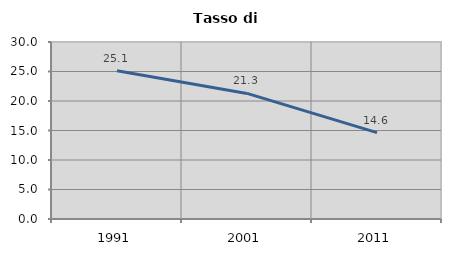
| Category | Tasso di disoccupazione   |
|---|---|
| 1991.0 | 25.111 |
| 2001.0 | 21.287 |
| 2011.0 | 14.648 |